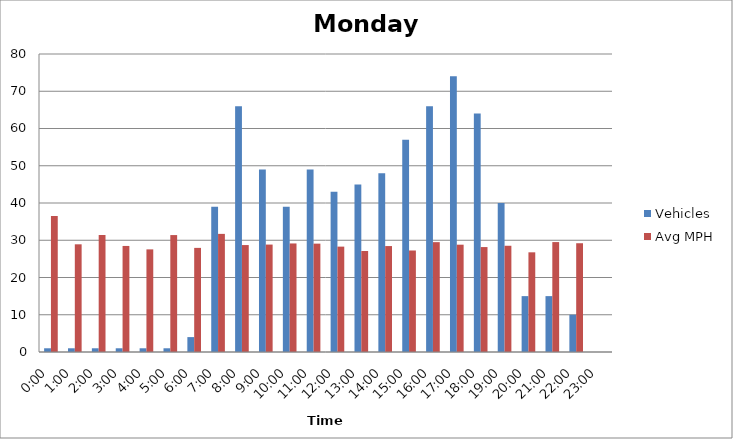
| Category | Vehicles | Avg MPH |
|---|---|---|
| 0:00 | 1 | 36.51 |
| 1:00 | 1 | 28.91 |
| 2:00 | 1 | 31.41 |
| 3:00 | 1 | 28.47 |
| 4:00 | 1 | 27.55 |
| 5:00 | 1 | 31.39 |
| 6:00 | 4 | 27.95 |
| 7:00 | 39 | 31.71 |
| 8:00 | 66 | 28.71 |
| 9:00 | 49 | 28.84 |
| 10:00 | 39 | 29.14 |
| 11:00 | 49 | 29.09 |
| 12:00 | 43 | 28.29 |
| 13:00 | 45 | 27.11 |
| 14:00 | 48 | 28.44 |
| 15:00 | 57 | 27.25 |
| 16:00 | 66 | 29.49 |
| 17:00 | 74 | 28.81 |
| 18:00 | 64 | 28.17 |
| 19:00 | 40 | 28.52 |
| 20:00 | 15 | 26.76 |
| 21:00 | 15 | 29.51 |
| 22:00 | 10 | 29.2 |
| 23:00 | 0 | 0 |